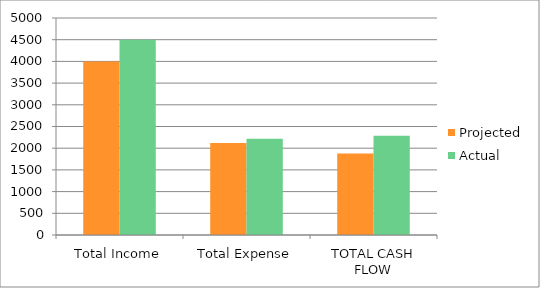
| Category | Projected | Actual |
|---|---|---|
| Total Income | 4000 | 4500 |
| Total Expense | 2122 | 2215 |
| TOTAL CASH FLOW | 1878 | 2285 |